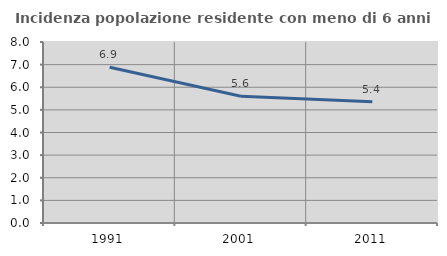
| Category | Incidenza popolazione residente con meno di 6 anni |
|---|---|
| 1991.0 | 6.885 |
| 2001.0 | 5.601 |
| 2011.0 | 5.36 |